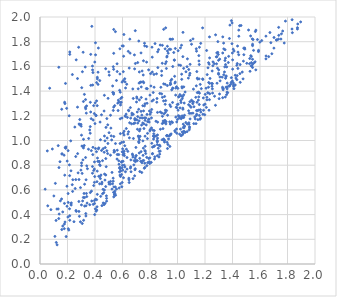
| Category | Series 0 |
|---|---|
| 1.2218439012456264 | 1.588 |
| 1.098014895399271 | 1.269 |
| 1.2983061203218698 | 1.649 |
| 0.3839702323072054 | 0.886 |
| 0.6031992104288864 | 0.884 |
| 0.9185398873408457 | 1.638 |
| 0.3338678232084469 | 0.389 |
| 0.30999605804753827 | 0.51 |
| 0.9876129833916178 | 1.19 |
| 0.44720470974408544 | 1.208 |
| 0.33435444458668484 | 0.471 |
| 0.5562552307957596 | 0.607 |
| 1.2936754097176255 | 1.801 |
| 1.0272133026357173 | 1.177 |
| 0.5844185690861705 | 0.649 |
| 1.3028751654369137 | 1.339 |
| 0.41093475952205183 | 0.909 |
| 1.5366162030314177 | 1.681 |
| 0.8508044712303935 | 1.34 |
| 0.5442990048847431 | 0.59 |
| 0.21380399254861637 | 0.803 |
| 0.41482181783545324 | 0.463 |
| 0.40775211635299624 | 1.204 |
| 1.776053556077506 | 1.789 |
| 1.11106400504377 | 1.298 |
| 0.28102032400536237 | 1.755 |
| 0.9775978779791148 | 1.65 |
| 0.21647126948937845 | 1.697 |
| 0.4116763271382473 | 1.469 |
| 1.3460215947219256 | 1.735 |
| 0.611390552367961 | 1.044 |
| 0.9020472815559084 | 1.216 |
| 1.1184892065275662 | 1.137 |
| 1.1417345326340806 | 1.309 |
| 1.0132638590411123 | 1.182 |
| 0.32403097244305856 | 0.538 |
| 1.0615949629122707 | 1.556 |
| 1.169915397426366 | 1.23 |
| 1.1385003844497923 | 1.723 |
| 1.0477382701204396 | 1.103 |
| 0.5762318395763861 | 0.616 |
| 0.8668297736381099 | 0.912 |
| 0.6125606962958849 | 0.8 |
| 1.5580042286616895 | 1.63 |
| 0.27282163506710044 | 1.27 |
| 1.2572452846246833 | 1.605 |
| 0.7579924179842967 | 1.183 |
| 1.4198943572264673 | 1.449 |
| 0.3696309892706051 | 1.447 |
| 1.4072451319230919 | 1.449 |
| 1.5496914641966506 | 1.817 |
| 0.9404242631431408 | 1.739 |
| 0.5926450566075927 | 0.824 |
| 0.8956817855322194 | 1.158 |
| 0.9831424720119029 | 1.071 |
| 1.0853105222925261 | 1.22 |
| 0.9158376140196698 | 1.134 |
| 0.5952484536624827 | 1.349 |
| 1.026166147746547 | 1.039 |
| 1.0836086596257017 | 1.131 |
| 0.9943617862884919 | 1.15 |
| 0.8089333514799006 | 0.823 |
| 0.9346957195443937 | 1.013 |
| 0.7426169409774064 | 1.563 |
| 1.045715516224044 | 1.434 |
| 1.041973174788376 | 1.105 |
| 0.29441975231596085 | 0.618 |
| 0.7978713951440373 | 0.814 |
| 0.830683358484164 | 1.08 |
| 0.9263345700008605 | 1.445 |
| 0.3852389580686846 | 0.945 |
| 0.5972157759141059 | 0.779 |
| 1.1020580253099674 | 1.779 |
| 0.2235709859438535 | 0.997 |
| 0.6263000988285177 | 1.214 |
| 1.032482929524119 | 1.435 |
| 0.9728016430047752 | 1.712 |
| 1.3099792966071393 | 1.483 |
| 0.8892706660572447 | 1.625 |
| 0.8175702196041836 | 0.892 |
| 1.3767637211063037 | 1.444 |
| 0.8845185093942953 | 1.527 |
| 0.7539577371047679 | 0.838 |
| 1.5459434971788726 | 1.591 |
| 1.0234213303663824 | 1.323 |
| 0.6277295385501236 | 1.097 |
| 0.7483840160849888 | 0.997 |
| 0.8603188429485731 | 0.937 |
| 1.4347417296441138 | 1.623 |
| 0.5835977730184894 | 1.391 |
| 0.57826173062942 | 0.746 |
| 0.25598270873921614 | 0.611 |
| 1.5645076297075593 | 1.637 |
| 0.43220225079006713 | 0.827 |
| 1.3452482734581228 | 1.648 |
| 0.7938848960934706 | 0.828 |
| 0.5393514409625824 | 0.92 |
| 0.8002662267528184 | 1.212 |
| 1.6720300216923099 | 1.874 |
| 1.1515663303154453 | 1.327 |
| 0.7713178461223904 | 1.335 |
| 1.431703862487234 | 1.493 |
| 0.7531014100896376 | 1.24 |
| 0.13690277748655744 | 1.593 |
| 0.7033460478603368 | 1.352 |
| 0.2147112240423552 | 0.447 |
| 0.5939200315358202 | 0.985 |
| 0.5330532696309866 | 1.597 |
| 1.1484378250664349 | 1.169 |
| 0.8741105018048414 | 1.773 |
| 0.31564634079833986 | 1.316 |
| 0.9808428145961892 | 1.08 |
| 0.6042654760241108 | 0.832 |
| 0.8327957148277367 | 0.956 |
| 1.0342683498548746 | 1.339 |
| 1.0877340532110122 | 1.529 |
| 0.6420604974288147 | 1.722 |
| 0.608230958419167 | 1.682 |
| 0.5933943836059778 | 0.725 |
| 0.6118853155468102 | 1.076 |
| 0.7236319418503554 | 1.006 |
| 1.2989352762787736 | 1.536 |
| 1.8335302098636443 | 1.978 |
| 0.3152180063910466 | 0.539 |
| 0.6120678479395079 | 0.914 |
| 0.5856144713421705 | 1.287 |
| 0.10082685639073419 | 0.551 |
| 0.6935753725881428 | 1.623 |
| 0.8714780343473179 | 1.381 |
| 1.3615931056602362 | 1.465 |
| 0.671887957357443 | 0.89 |
| 0.8121758794493519 | 1.251 |
| 0.9268505017884752 | 1.725 |
| 0.7784021240848733 | 1.211 |
| 1.5317370297482054 | 1.847 |
| 1.0829780837714365 | 1.143 |
| 1.233466786739652 | 1.669 |
| 0.708589514465525 | 1.091 |
| 0.2978116857149764 | 1.131 |
| 0.9633858408181453 | 1.145 |
| 0.6929328786871911 | 1.889 |
| 1.5459555457068062 | 1.768 |
| 0.9064107741863041 | 1.002 |
| 0.7828540420382242 | 1.153 |
| 0.9839532680753853 | 1.473 |
| 0.5730467726893789 | 0.886 |
| 1.598975551555259 | 1.796 |
| 0.316299216477099 | 1.01 |
| 0.1901160977747185 | 0.222 |
| 1.433943611413578 | 1.525 |
| 0.7368903179334834 | 1.348 |
| 0.7215544270673266 | 0.899 |
| 0.6682327233794096 | 1.221 |
| 0.10855839887400931 | 0.224 |
| 1.1893593227495252 | 1.245 |
| 0.8750971402947192 | 1.231 |
| 1.030131623295237 | 1.537 |
| 0.6792832802877506 | 1.016 |
| 0.5156293567053438 | 1.101 |
| 1.0099032024932786 | 1.611 |
| 0.5810954588714137 | 1.743 |
| 0.22485752225037592 | 0.486 |
| 0.7400489391606699 | 0.741 |
| 1.0418043898503475 | 1.133 |
| 1.2326456637022105 | 1.839 |
| 0.701913542903674 | 1.312 |
| 0.32894804692453183 | 1.595 |
| 1.2344538855298488 | 1.379 |
| 0.6487431745905416 | 1.587 |
| 1.0788973973462948 | 1.505 |
| 0.8182332834815869 | 0.946 |
| 1.359258664342939 | 1.431 |
| 0.1800401520075816 | 0.719 |
| 0.6974814407696226 | 0.944 |
| 0.5354839519745496 | 1.576 |
| 1.1732841332734962 | 1.42 |
| 0.8287468140334626 | 1.535 |
| 0.7515228227007948 | 0.938 |
| 0.5679885143467776 | 1.242 |
| 1.4769292375593372 | 1.499 |
| 0.4725618126500639 | 0.997 |
| 1.1572285149585693 | 1.499 |
| 0.705478199004139 | 1.167 |
| 0.9446103707527298 | 0.952 |
| 1.0054892699931313 | 1.201 |
| 0.15867802653583385 | 0.279 |
| 0.5619079732628445 | 0.886 |
| 1.5696539278500001 | 1.572 |
| 1.1094724922208865 | 1.314 |
| 0.9244494545173734 | 0.985 |
| 0.7195078870267326 | 0.983 |
| 1.4621160274763882 | 1.931 |
| 1.1583889036103905 | 1.615 |
| 0.3426089538836803 | 0.493 |
| 1.1587952828556718 | 1.203 |
| 0.9640875106986238 | 1.308 |
| 0.4170264989627428 | 1.512 |
| 0.7348562723620775 | 1.236 |
| 0.23554556971769225 | 1.534 |
| 1.4899104722100902 | 1.74 |
| 0.36177269522160405 | 0.48 |
| 1.8957463833883945 | 1.96 |
| 1.3272772158403192 | 1.431 |
| 0.8041658039727637 | 1.541 |
| 0.4393831482159234 | 0.692 |
| 0.40336457067451614 | 1.791 |
| 0.18133560581736718 | 1.299 |
| 0.7077701345903693 | 0.837 |
| 0.8531901976618477 | 0.877 |
| 0.5614235871138877 | 1.558 |
| 0.4860871238617075 | 1.177 |
| 0.4434238108316426 | 0.72 |
| 0.9062695790835005 | 1.356 |
| 0.736388670372232 | 1.434 |
| 0.4504680736435942 | 0.662 |
| 0.4918397272495463 | 0.894 |
| 0.6328616122141804 | 0.862 |
| 1.0399426568287011 | 1.876 |
| 1.0513311547775737 | 1.116 |
| 1.1386825178260347 | 1.242 |
| 1.1289466691160808 | 1.175 |
| 0.4222069447723713 | 1.454 |
| 0.6896781710652691 | 1.177 |
| 0.4656247719941722 | 0.48 |
| 1.0909398721811447 | 1.28 |
| 0.2598017860643078 | 0.87 |
| 0.7496070964246719 | 0.88 |
| 1.2118370887275098 | 1.729 |
| 0.1765838065834633 | 0.286 |
| 0.5176988614106606 | 1.038 |
| 0.5350907005591026 | 1.375 |
| 0.8199975516259286 | 1.084 |
| 1.147028287477013 | 1.498 |
| 1.4563860540414724 | 1.471 |
| 0.38305811722215255 | 1.449 |
| 1.1599083739094875 | 1.383 |
| 0.6572685529970399 | 1.266 |
| 1.3789534199669327 | 1.441 |
| 0.9647308391014944 | 1.821 |
| 0.8298556559602015 | 1.431 |
| 0.6924761866439733 | 0.771 |
| 1.0260493575688001 | 1.307 |
| 1.0154909617268193 | 1.051 |
| 0.5359083844310255 | 1.385 |
| 0.3524459421707431 | 0.93 |
| 1.1159388633155445 | 1.313 |
| 0.5421963695091325 | 0.562 |
| 0.4550096738464813 | 0.569 |
| 0.9119630500511589 | 1.622 |
| 0.5449536239142332 | 0.572 |
| 0.7753023612177816 | 1.635 |
| 0.45845547068731807 | 0.605 |
| 0.28322464153042604 | 0.426 |
| 1.0268078129248248 | 1.181 |
| 0.7141060475565466 | 1.419 |
| 1.0469616209504766 | 1.074 |
| 0.3662745925865627 | 1.309 |
| 0.42737248701645303 | 0.71 |
| 1.0388839749428 | 1.262 |
| 1.55297010371751 | 1.73 |
| 1.1664988419980773 | 1.249 |
| 0.5360246899322796 | 1.706 |
| 1.6431946055742126 | 1.661 |
| 0.9305455122461996 | 0.967 |
| 0.6061363205018213 | 1.765 |
| 0.8703965388262129 | 0.889 |
| 1.5360738263535543 | 1.603 |
| 0.5111682980276921 | 0.647 |
| 0.5984672556990174 | 0.909 |
| 0.3950396150239621 | 1.218 |
| 1.1559559180359398 | 1.644 |
| 1.0391443223941244 | 1.679 |
| 1.1829047715751349 | 1.499 |
| 0.7232654016447517 | 1.077 |
| 0.33082951495144663 | 1.27 |
| 0.2162897112247899 | 0.354 |
| 0.7280379294299506 | 1.034 |
| 1.2159471007621465 | 1.534 |
| 0.49276166752800776 | 1.127 |
| 1.3569303457659465 | 1.371 |
| 0.42917067157886213 | 0.832 |
| 1.400968999393942 | 1.578 |
| 0.28762122238618293 | 1.129 |
| 0.8944297144158875 | 1.096 |
| 1.3580967153816699 | 1.596 |
| 0.4686672674234116 | 1.036 |
| 1.1441023634939171 | 1.388 |
| 0.9264222117706054 | 1.763 |
| 0.6435020915970244 | 1.245 |
| 0.9508598157283614 | 1.456 |
| 0.7406128589610899 | 1.206 |
| 1.0184672564961297 | 1.264 |
| 0.7641196455293999 | 1.035 |
| 0.7563490404740141 | 1.134 |
| 0.9953606778991717 | 1.058 |
| 0.481411744306921 | 0.788 |
| 1.2323867523000713 | 1.331 |
| 1.0919162704512912 | 1.617 |
| 1.221625907459518 | 1.386 |
| 1.3612037412775655 | 1.418 |
| 0.5812936299337086 | 1.538 |
| 1.1844071880578293 | 1.494 |
| 1.2859736452021324 | 1.71 |
| 1.4542233441455035 | 1.541 |
| 0.4245695057152208 | 1.749 |
| 1.3320489006404805 | 1.421 |
| 0.717708837889123 | 1.253 |
| 0.30363263930241247 | 1.428 |
| 0.7997465710151417 | 1.367 |
| 0.9485721478350315 | 1.465 |
| 0.3171425597457733 | 0.354 |
| 0.8143590010212451 | 1.319 |
| 0.344908593684101 | 0.772 |
| 1.3251021634850468 | 1.513 |
| 0.35388479573483655 | 1.016 |
| 0.5485294435691475 | 1.881 |
| 0.9473765629220257 | 1.133 |
| 1.1538265783660666 | 1.391 |
| 1.1592704566812244 | 1.755 |
| 0.7175130114111308 | 0.991 |
| 0.4132548873710453 | 0.437 |
| 0.29955293029459984 | 1.116 |
| 0.42013752800392457 | 0.831 |
| 0.381556075953962 | 0.789 |
| 0.7731310248896628 | 1.421 |
| 0.9063116127575035 | 1.148 |
| 0.8233687381296269 | 1.388 |
| 1.4083705981495895 | 1.438 |
| 0.205597692026118 | 0.285 |
| 1.2365287311468578 | 1.503 |
| 0.9521422946384925 | 1.819 |
| 1.2204996942721946 | 1.386 |
| 1.3070983194879373 | 1.659 |
| 0.7207651381117288 | 1.159 |
| 0.26427039403099384 | 0.426 |
| 0.9269919106679096 | 0.935 |
| 0.8556763439240755 | 1.718 |
| 1.3530156055650011 | 1.432 |
| 0.923223237327792 | 1.041 |
| 0.6223018093836972 | 1.425 |
| 0.47241129021205697 | 0.68 |
| 0.9322082297919252 | 1.707 |
| 1.445744699134523 | 1.894 |
| 1.1557171219072664 | 1.247 |
| 0.5212716756061033 | 1.004 |
| 0.542178217545155 | 0.56 |
| 1.734104984620247 | 1.821 |
| 0.5702813843730699 | 1.327 |
| 0.5326325532829821 | 0.671 |
| 0.8571218427572314 | 1.59 |
| 0.5037031525339817 | 1.529 |
| 0.998064276338394 | 1.291 |
| 0.7595942467378398 | 1.28 |
| 1.28679077238717 | 1.678 |
| 1.2537670759262167 | 1.46 |
| 0.617503284737086 | 0.786 |
| 0.5966541451238987 | 1.182 |
| 0.7640198577513377 | 1.298 |
| 1.4107228453776022 | 1.42 |
| 0.37321778727640065 | 0.918 |
| 0.11675335911017837 | 0.353 |
| 1.527677843087685 | 1.56 |
| 1.3697469417442047 | 1.631 |
| 0.17756114699735037 | 0.324 |
| 0.9809168632436327 | 1.465 |
| 0.44128101023469113 | 0.548 |
| 0.7478004787939521 | 1.281 |
| 1.0488338151182124 | 1.303 |
| 0.36128792094212514 | 1.085 |
| 0.3247864497795405 | 0.469 |
| 1.1438786335205504 | 1.505 |
| 0.3954128463098152 | 0.513 |
| 0.5655496817371384 | 1.303 |
| 1.3720780643709671 | 1.682 |
| 1.6632634554533845 | 1.679 |
| 0.2534635448320801 | 1.109 |
| 0.4339252262408604 | 0.649 |
| 0.9791003177777642 | 1.52 |
| 0.9951944464993214 | 1.266 |
| 0.9657395266796094 | 1.422 |
| 0.12307852951711218 | 0.445 |
| 0.4361264053144842 | 0.709 |
| 0.8757122243338036 | 1.091 |
| 0.5991230476101763 | 0.798 |
| 0.7686844769785539 | 0.895 |
| 0.5807324583340321 | 0.783 |
| 0.9100417820147795 | 1.742 |
| 0.6925028335281178 | 0.859 |
| 0.6609248646386956 | 0.843 |
| 0.8547406535673125 | 1.045 |
| 0.2121797114022257 | 1.2 |
| 1.2932527981877473 | 1.714 |
| 0.45466020013040986 | 0.837 |
| 0.7499515859753592 | 1.476 |
| 1.2909388448611196 | 1.585 |
| 1.7850536887579198 | 1.967 |
| 1.136529911691882 | 1.743 |
| 1.589446461442532 | 1.73 |
| 0.8554631574639058 | 1.148 |
| 0.8736747311993678 | 0.954 |
| 0.23707538896356262 | 0.588 |
| 1.0699492138184499 | 1.072 |
| 1.7650539367011653 | 1.886 |
| 1.5332451715376307 | 1.687 |
| 0.31266939673935634 | 0.952 |
| 0.9505943864150721 | 1.275 |
| 0.6850128043933019 | 0.837 |
| 0.5847583993227867 | 1.056 |
| 0.7819604637828463 | 1.058 |
| 0.8903845899614979 | 1.196 |
| 1.035996640441257 | 1.046 |
| 0.8847263275344706 | 1.563 |
| 0.31375465829314786 | 1.715 |
| 0.43966352800713704 | 1.006 |
| 0.38224838450005727 | 1.572 |
| 1.133010235328639 | 1.349 |
| 1.4314419432200818 | 1.609 |
| 1.5702102339087451 | 1.894 |
| 1.1128404948477884 | 1.823 |
| 1.0176847203249602 | 1.372 |
| 0.13637475051319625 | 0.368 |
| 0.11860145658523624 | 0.174 |
| 1.0983253627654617 | 1.22 |
| 1.5371915150530182 | 1.631 |
| 1.4008997641598142 | 1.653 |
| 0.5909593019766808 | 1.31 |
| 0.8432239569175235 | 1.156 |
| 0.5620123470379008 | 0.921 |
| 1.0872630942910402 | 1.111 |
| 0.7989648197917767 | 1.078 |
| 0.8328720035522088 | 0.85 |
| 0.537410289808123 | 0.624 |
| 0.7417678081173402 | 0.819 |
| 0.4220529976101226 | 1.553 |
| 0.8349218740116411 | 0.868 |
| 0.26157937648799634 | 0.433 |
| 0.754121194823429 | 1.468 |
| 1.1824645599855965 | 1.912 |
| 0.45052250998550614 | 0.473 |
| 1.3414729428956589 | 1.555 |
| 0.3014385236513766 | 0.478 |
| 0.7055624871076516 | 1.342 |
| 0.6782839035664838 | 1.341 |
| 0.5124827171537243 | 0.881 |
| 1.2266910104228403 | 1.469 |
| 0.1778261719614096 | 0.491 |
| 1.1553596371227508 | 1.687 |
| 1.4247561332160223 | 1.506 |
| 0.7186078930940021 | 1.805 |
| 0.8884234479663979 | 1.006 |
| 0.6682205372946877 | 1.206 |
| 1.8329128028686068 | 1.903 |
| 1.1255670874791817 | 1.191 |
| 1.201508176478414 | 1.373 |
| 1.2012478142240797 | 1.295 |
| 0.30502637512801245 | 0.955 |
| 0.9280393211444653 | 1.205 |
| 0.8789820020601276 | 1.431 |
| 0.9056015928582195 | 0.987 |
| 0.6010289352483627 | 0.932 |
| 0.5320547157662705 | 0.695 |
| 0.5328939965551052 | 1.244 |
| 0.874300640303646 | 0.914 |
| 0.14527537815524827 | 0.828 |
| 0.7584348199973876 | 0.776 |
| 0.6102301977583884 | 1.858 |
| 0.21658665157826062 | 1.717 |
| 1.0447961119007918 | 1.186 |
| 1.3319295254940213 | 1.411 |
| 0.39547040717190485 | 0.769 |
| 1.1121984649698275 | 1.221 |
| 0.854639704787967 | 1.019 |
| 0.8071991298504182 | 1.228 |
| 0.675049184525397 | 1.417 |
| 0.13248392315997415 | 0.958 |
| 0.1393786875026406 | 0.404 |
| 0.7691860078938237 | 1.183 |
| 0.957758863112484 | 1.496 |
| 0.6961327642528732 | 0.84 |
| 1.3973275129982476 | 1.952 |
| 0.6029827377339434 | 0.905 |
| 1.4199581060074264 | 1.528 |
| 0.8162904666906139 | 1.675 |
| 1.3650317101893525 | 1.387 |
| 0.2827360408477746 | 0.506 |
| 1.29820962867925 | 1.544 |
| 0.7230329217058284 | 1.329 |
| 1.0338983131907677 | 1.07 |
| 1.755881361744406 | 1.864 |
| 0.5367131943552692 | 1.033 |
| 0.9929387803097551 | 1.093 |
| 0.5274414040695239 | 0.65 |
| 0.6899498170408143 | 1.141 |
| 0.3986019865809689 | 1.635 |
| 0.2252115326944113 | 0.755 |
| 0.6517753845424585 | 1.143 |
| 0.17525616024358426 | 0.881 |
| 0.9225669276549431 | 1.676 |
| 1.5439083050429405 | 1.823 |
| 0.5853966526480276 | 1.307 |
| 0.376222318005206 | 0.51 |
| 1.5664042497073651 | 1.883 |
| 1.5239764910208253 | 1.622 |
| 0.8688944080991061 | 0.961 |
| 0.5869617274327297 | 1.34 |
| 0.9207018289636886 | 1.242 |
| 1.7365821136627224 | 1.852 |
| 1.1393855841057008 | 1.212 |
| 0.6533232916265657 | 1.821 |
| 0.536073825313123 | 1.899 |
| 1.0854799276605314 | 1.087 |
| 1.2967976635802982 | 1.697 |
| 0.4346800134719675 | 1.485 |
| 0.9208053513602332 | 1.038 |
| 1.1584310402681406 | 1.291 |
| 0.1381102681569324 | 0.781 |
| 1.033225310942381 | 1.426 |
| 0.39014590893727297 | 1.282 |
| 1.042753115419136 | 1.19 |
| 0.3022081630846103 | 0.818 |
| 0.7346688796082557 | 1.473 |
| 0.33121554497143646 | 1.331 |
| 0.8131659744024073 | 0.977 |
| 0.9457544402825058 | 1.821 |
| 0.8275784549059821 | 0.951 |
| 0.17916285965748657 | 1.31 |
| 1.5457992879483937 | 1.657 |
| 0.5479734842693906 | 0.624 |
| 0.320276159070209 | 0.571 |
| 1.5409608141215818 | 1.605 |
| 0.22679497783314972 | 0.477 |
| 1.1194372940982955 | 1.273 |
| 0.3978734296452826 | 0.708 |
| 0.4159970453215114 | 1.282 |
| 0.056481289587323014 | 0.471 |
| 1.0142927673491597 | 1.196 |
| 0.36860238040454263 | 1.231 |
| 0.9762155721551531 | 1.652 |
| 0.7643516404876305 | 1.163 |
| 0.8339196326369882 | 1.033 |
| 0.5779797451717619 | 0.777 |
| 0.8065085716842288 | 1.441 |
| 0.48309221959683124 | 0.552 |
| 0.6659531557879299 | 1.135 |
| 0.8545754650711865 | 1.228 |
| 1.0903435485854784 | 1.544 |
| 0.7960486961205553 | 1.239 |
| 1.1548465827812366 | 1.353 |
| 0.16562339845436913 | 0.307 |
| 1.2696325556595187 | 1.359 |
| 1.2253726703384977 | 1.431 |
| 0.541621698474823 | 0.911 |
| 0.372323834918576 | 1.177 |
| 1.3307752371038315 | 1.419 |
| 0.7206972437259656 | 1.465 |
| 0.053173935926630556 | 0.916 |
| 0.3957381378528788 | 0.661 |
| 1.39931397426615 | 1.482 |
| 0.824764788013727 | 1.329 |
| 0.6906069202391609 | 0.763 |
| 0.5746826932777906 | 0.808 |
| 1.2823203111859487 | 1.677 |
| 0.6964907083167196 | 0.874 |
| 1.8353693358574215 | 1.873 |
| 0.3815791110127318 | 1.603 |
| 1.391851743350455 | 1.97 |
| 0.2893210066241658 | 1.17 |
| 0.587659838568509 | 0.753 |
| 0.2976655751656483 | 0.76 |
| 0.7108830863931952 | 1.141 |
| 1.451675098302165 | 1.929 |
| 0.4039580089338073 | 1.694 |
| 0.7991372915705266 | 0.86 |
| 0.07936720064783098 | 0.44 |
| 1.0377204504651694 | 1.356 |
| 0.8895241238932405 | 1.137 |
| 0.7771492158405933 | 0.796 |
| 0.38506008202053255 | 1.55 |
| 0.5357150241595625 | 1.271 |
| 1.25110105329228 | 1.439 |
| 0.18203794475266522 | 0.34 |
| 1.1980838917793866 | 1.209 |
| 0.6746249856347515 | 0.882 |
| 0.6827191007027811 | 0.802 |
| 1.3621410020239972 | 1.434 |
| 0.46836698784415143 | 0.599 |
| 1.7186831075255655 | 1.814 |
| 0.12444407426209314 | 0.155 |
| 0.6928078270960718 | 1.167 |
| 0.23890620906110804 | 0.682 |
| 0.5602002281514593 | 0.85 |
| 0.6593138274706682 | 1.181 |
| 0.3655838368505475 | 1.112 |
| 1.4793738098811235 | 1.643 |
| 0.18906854177490673 | 0.948 |
| 0.6621658954199372 | 0.747 |
| 1.440096452619907 | 1.716 |
| 0.7831307060043711 | 0.82 |
| 1.643263533747122 | 1.845 |
| 0.4728219573465917 | 0.491 |
| 1.165507744481734 | 1.454 |
| 0.4594208664188393 | 0.934 |
| 0.6027843466110596 | 0.759 |
| 1.2551506114462314 | 1.384 |
| 0.41729130916232116 | 1.499 |
| 0.8532229879989319 | 0.992 |
| 0.34010414288522806 | 0.546 |
| 0.9191395750102354 | 1.583 |
| 0.46830746175631566 | 1.366 |
| 0.3652174988159669 | 1.059 |
| 0.8991345910963813 | 1.012 |
| 0.957877649496903 | 1.41 |
| 0.923938530386861 | 1.683 |
| 0.3998883995160103 | 1.137 |
| 0.6470055366185241 | 0.682 |
| 1.2581834144276762 | 1.637 |
| 0.6133286844766395 | 0.877 |
| 0.20456690083768114 | 0.571 |
| 0.3228418139546172 | 1.373 |
| 1.3990696982524649 | 1.708 |
| 0.33304574570638534 | 0.408 |
| 1.5812887038956354 | 1.817 |
| 0.8530014844345697 | 0.989 |
| 1.3287311500415795 | 1.346 |
| 0.1853428222272775 | 1.462 |
| 0.5236388679428197 | 0.606 |
| 1.0332811433241227 | 1.2 |
| 0.6285338119995441 | 0.93 |
| 0.9486222174888737 | 1.046 |
| 0.7909716616965989 | 0.855 |
| 0.7105180280131151 | 1.631 |
| 0.5734290575812788 | 1.311 |
| 1.2305335833000381 | 1.618 |
| 0.20966078938539834 | 0.275 |
| 1.3489871293865108 | 1.667 |
| 0.5237449891582446 | 0.742 |
| 0.44971928865159394 | 0.648 |
| 1.349645269900196 | 1.615 |
| 0.7657419978895956 | 0.914 |
| 0.6327292977412393 | 0.768 |
| 0.5498683516953802 | 0.556 |
| 1.588810061696633 | 1.72 |
| 0.6900214997183225 | 1.167 |
| 1.8747165961063872 | 1.943 |
| 1.1878647737060064 | 1.345 |
| 0.6195578261030366 | 1.199 |
| 0.5386043066569881 | 0.905 |
| 1.4888539725812695 | 1.749 |
| 0.5950249167650288 | 0.626 |
| 0.15902665948236905 | 0.89 |
| 1.3601913251407818 | 1.391 |
| 0.4842836220041018 | 0.531 |
| 1.6442579458289395 | 1.684 |
| 0.6456457233293187 | 1.241 |
| 0.7560988289430646 | 1.097 |
| 1.1848877336779426 | 1.212 |
| 0.635628597714383 | 1.187 |
| 0.8365972773772539 | 1.785 |
| 0.39668816209832825 | 0.49 |
| 0.3122430290936906 | 0.843 |
| 1.3495205139673525 | 1.504 |
| 1.0265050785682261 | 1.36 |
| 0.8276452339323106 | 1.054 |
| 1.0815663796387023 | 1.575 |
| 1.0029892142421952 | 1.422 |
| 0.3688441956153323 | 1.697 |
| 1.0709757550634602 | 1.133 |
| 1.2078323887897968 | 1.423 |
| 0.08990121697938247 | 0.931 |
| 1.072221956996583 | 1.661 |
| 1.406634097928618 | 1.465 |
| 0.5941545507519306 | 0.828 |
| 0.20512698718729405 | 0.499 |
| 1.0084362080964369 | 1.353 |
| 0.1606017941721276 | 0.893 |
| 0.7002381282331902 | 0.878 |
| 0.8653284232875944 | 0.867 |
| 1.5471112018616633 | 1.619 |
| 1.137333899728552 | 1.202 |
| 1.8723244401686312 | 1.914 |
| 0.19378658688458472 | 1.26 |
| 1.3479077867649762 | 1.353 |
| 0.8258879844045699 | 1.012 |
| 0.28663175445129996 | 0.386 |
| 1.3872433062174059 | 1.455 |
| 0.9117984911965056 | 1.245 |
| 0.40121070984781015 | 1.304 |
| 0.6214157068838857 | 0.747 |
| 0.7899549445286864 | 1.572 |
| 0.8186780489661851 | 0.894 |
| 1.0810457639989157 | 1.241 |
| 0.8169074133899377 | 1.554 |
| 0.4073282116505321 | 1.201 |
| 0.7648899863318506 | 0.953 |
| 0.6867863691771341 | 1.693 |
| 1.0420641331447165 | 1.057 |
| 0.27281944910637 | 1.502 |
| 0.6577045206734595 | 0.777 |
| 0.6596726884412849 | 0.787 |
| 1.0383006091970515 | 1.189 |
| 0.20453757630681935 | 0.918 |
| 0.40793828118451336 | 0.427 |
| 1.0215125105720528 | 1.092 |
| 0.9090110606704127 | 1.163 |
| 0.6766924688241087 | 0.691 |
| 1.4115861705183133 | 1.725 |
| 1.3916096307249886 | 1.509 |
| 0.2160951462998686 | 0.391 |
| 0.19604897710777047 | 0.63 |
| 0.4797839533143746 | 1.106 |
| 1.0508401569817238 | 1.204 |
| 1.0915766942353873 | 1.175 |
| 1.0874578080972428 | 1.102 |
| 1.525413148556475 | 1.664 |
| 0.5823307734259402 | 0.976 |
| 0.512984179948097 | 0.669 |
| 0.5976268059274175 | 1.766 |
| 1.1639620157664847 | 1.172 |
| 0.7627385798522024 | 0.918 |
| 1.3813308108853648 | 1.934 |
| 0.7761897310600143 | 1.761 |
| 1.0565633820607068 | 1.066 |
| 0.4743823444106585 | 0.943 |
| 0.6462227953202524 | 0.695 |
| 0.6394372265699149 | 1.052 |
| 1.2838870363070831 | 1.621 |
| 0.7351316091752134 | 0.91 |
| 1.0046377906656658 | 1.727 |
| 0.37695334448132134 | 1.924 |
| 0.7276262761149068 | 1.183 |
| 0.365822097356993 | 0.579 |
| 0.9173008748066152 | 1.152 |
| 1.6789645913328437 | 1.792 |
| 0.648504606007789 | 0.66 |
| 1.0307856512677012 | 1.495 |
| 0.7614253878151638 | 1.766 |
| 1.080923732581063 | 1.29 |
| 1.2138594779553633 | 1.35 |
| 1.3438370158501844 | 1.596 |
| 0.4040739169579788 | 0.935 |
| 1.3902650318226002 | 1.47 |
| 0.6166418834577738 | 0.958 |
| 0.26322020330799734 | 1.653 |
| 1.5460370207197083 | 1.78 |
| 0.33510117691076835 | 0.682 |
| 0.7924402641247212 | 1.172 |
| 0.734664247903466 | 1.709 |
| 0.30726998254732507 | 0.328 |
| 0.2842899276165394 | 1.134 |
| 0.7289935583150284 | 1.472 |
| 0.6941083995668005 | 0.829 |
| 0.643933827047265 | 1.071 |
| 0.5010189124502233 | 1.555 |
| 1.3543746248822308 | 1.522 |
| 0.1578656519334285 | 1.253 |
| 0.8679720999996474 | 0.96 |
| 0.7432272092057934 | 1.182 |
| 0.03744860909753056 | 0.606 |
| 0.5350953189677432 | 0.58 |
| 0.500733191686483 | 0.662 |
| 0.6880958930852987 | 1.58 |
| 0.5969344198565294 | 1.473 |
| 0.9119015436860611 | 1.227 |
| 0.9105656663414001 | 1.293 |
| 1.4554971012137712 | 1.615 |
| 1.5040544604800024 | 1.625 |
| 0.14822169095322235 | 0.511 |
| 0.9291734297530441 | 1.038 |
| 0.30232675209570514 | 0.796 |
| 0.6756456752131257 | 0.866 |
| 0.8993538760406881 | 1.9 |
| 0.7072160831258432 | 1.231 |
| 0.5606058445039628 | 1.621 |
| 1.233506336094475 | 1.463 |
| 0.18371606827005804 | 0.943 |
| 0.22773425766580813 | 0.495 |
| 0.8107526001325176 | 1.183 |
| 0.5024069175158457 | 1.063 |
| 1.686253069539074 | 1.702 |
| 1.214252317240446 | 1.329 |
| 0.6072522156435112 | 0.698 |
| 0.4121410918294681 | 0.521 |
| 0.789803799779548 | 1.172 |
| 1.3288444031604592 | 1.709 |
| 1.2258946845365442 | 1.63 |
| 0.337464053613892 | 0.571 |
| 0.9580251638090855 | 1.152 |
| 0.6307244624282298 | 1.456 |
| 0.638768268133219 | 0.912 |
| 1.4393238945075126 | 1.583 |
| 1.2670750149033703 | 1.622 |
| 1.4825710177944442 | 1.695 |
| 1.2292521852548361 | 1.245 |
| 0.33214529591882114 | 1.257 |
| 0.8470685445850221 | 1.54 |
| 0.543357071521485 | 1.282 |
| 0.7259437755386631 | 0.749 |
| 0.1117748117642623 | 0.653 |
| 0.8496330846790769 | 1.31 |
| 0.9514694040117102 | 1.486 |
| 1.5168211198539268 | 1.894 |
| 0.47855633006752396 | 0.721 |
| 1.0945297083018592 | 1.81 |
| 1.0447656227365438 | 1.584 |
| 1.8720462269837792 | 1.902 |
| 1.0095731392242402 | 1.355 |
| 0.8280113869169929 | 1.032 |
| 0.3159959213923291 | 0.94 |
| 0.8438756682785846 | 1.038 |
| 0.9003411125692606 | 1.003 |
| 0.26034940284638375 | 0.683 |
| 1.2769151211437373 | 1.856 |
| 1.0694347284760717 | 1.597 |
| 0.9535125929016408 | 1.053 |
| 1.0395128814642771 | 1.253 |
| 1.101863697136538 | 1.326 |
| 0.7507251334245837 | 1.53 |
| 0.5839863662556237 | 0.771 |
| 0.2029632316930936 | 0.38 |
| 0.6116561284161661 | 0.892 |
| 1.2760359264301064 | 1.285 |
| 0.15709496642902088 | 0.527 |
| 0.9433139459347544 | 1.151 |
| 0.7524614943092056 | 1.645 |
| 0.7600362429791658 | 1.788 |
| 0.5364794888038675 | 0.543 |
| 0.3868903992566004 | 1.166 |
| 0.725376769943016 | 0.855 |
| 1.1345975536074926 | 1.136 |
| 0.5024970806581117 | 0.647 |
| 0.13241838522067173 | 0.446 |
| 1.1406039019249892 | 1.558 |
| 0.74746127119194 | 1.142 |
| 0.7388742449504888 | 1.125 |
| 0.7621126049474722 | 0.816 |
| 0.7812247664650918 | 1.015 |
| 1.021459963151527 | 1.75 |
| 1.0608489005013995 | 1.145 |
| 1.2999735205372518 | 1.572 |
| 0.6783537618163389 | 1.213 |
| 0.3367128617519679 | 1.222 |
| 0.990713308080005 | 1.269 |
| 1.3367879161989302 | 1.742 |
| 1.0043662896793044 | 1.245 |
| 1.7219745868803888 | 1.813 |
| 0.40218719798667757 | 0.447 |
| 0.9842010510337942 | 1.745 |
| 0.18700050297015625 | 0.937 |
| 0.7628594088131011 | 0.781 |
| 0.8848265306850744 | 1.378 |
| 0.852934293708312 | 1.001 |
| 0.39631672914119465 | 0.827 |
| 0.9651457792375675 | 1.425 |
| 0.5835121065291027 | 1.176 |
| 0.7452332614752455 | 0.835 |
| 0.33154947016772973 | 0.862 |
| 0.4668007950220108 | 0.905 |
| 0.5853186443727396 | 0.709 |
| 1.3086452971655262 | 1.514 |
| 0.7279539479625741 | 1.092 |
| 0.4475516009985703 | 0.919 |
| 0.4636685850113813 | 0.577 |
| 0.7727863086885853 | 1.126 |
| 0.6499806257896967 | 1.022 |
| 0.8145085316355518 | 1.756 |
| 0.28370980872342444 | 0.684 |
| 0.5128496637420699 | 1.204 |
| 0.32168805025074176 | 0.96 |
| 1.4052596509091808 | 1.739 |
| 0.21536106777998043 | 0.716 |
| 0.6165781720914085 | 1.5 |
| 0.6082556536155943 | 0.988 |
| 0.6055025165064274 | 1.485 |
| 0.9483176672960787 | 1.048 |
| 1.2520891252433877 | 1.563 |
| 0.5282667630231024 | 1.441 |
| 1.2493276286494546 | 1.462 |
| 0.7788604081977151 | 1.301 |
| 1.0291518004673936 | 1.771 |
| 0.9875201479263329 | 1.424 |
| 1.4711630921309446 | 1.554 |
| 0.8899389618878697 | 1.771 |
| 0.5292520801874485 | 1.389 |
| 1.0485993473222892 | 1.114 |
| 0.6062001887374762 | 1.061 |
| 1.7523153633618922 | 1.821 |
| 1.2099315785794875 | 1.268 |
| 0.5561177411217377 | 1.486 |
| 0.4696212297366875 | 0.728 |
| 0.49375809565729845 | 0.976 |
| 0.39051027331913657 | 0.635 |
| 0.2736952488440392 | 0.894 |
| 0.8903084157780301 | 1.349 |
| 0.9997178789809993 | 1.171 |
| 0.46611763854928445 | 1.239 |
| 0.6059331559235963 | 1.557 |
| 0.8622569043067532 | 1.736 |
| 0.3064509333064922 | 0.734 |
| 0.3083220217582805 | 1.557 |
| 0.6185866460820362 | 1.475 |
| 0.47769530500980095 | 1.581 |
| 0.8020522152776111 | 1.089 |
| 0.9140409448558424 | 1.912 |
| 0.1966682179011845 | 0.468 |
| 1.3058917353704005 | 1.376 |
| 0.9503751665554911 | 1.738 |
| 0.47854938398171876 | 0.854 |
| 0.7325997533014044 | 0.831 |
| 0.8240086820523389 | 1.036 |
| 1.0899271929457996 | 1.314 |
| 0.7106693570532812 | 1.193 |
| 0.4033222835547299 | 0.524 |
| 1.0224187367019186 | 1.608 |
| 0.7804657493667366 | 1.42 |
| 0.7761068502081336 | 0.863 |
| 0.9865879048241968 | 1.368 |
| 0.810973442218875 | 1.102 |
| 0.5728486798841463 | 0.836 |
| 1.3962299798514164 | 1.784 |
| 0.8995183101365831 | 1.459 |
| 0.9404821019177199 | 1.036 |
| 0.41814214567259467 | 0.858 |
| 0.5489409161986025 | 0.975 |
| 1.6126627664869646 | 1.809 |
| 0.6942287805099805 | 1.172 |
| 1.1908815823914058 | 1.288 |
| 0.9443138498262973 | 1.289 |
| 1.16735090036106 | 1.179 |
| 1.116035024442993 | 1.416 |
| 1.3519668164269152 | 1.516 |
| 0.8525878661971262 | 0.967 |
| 0.6554321245735351 | 1.707 |
| 0.48637901001346573 | 0.917 |
| 1.7356657186510362 | 1.916 |
| 0.3398965903586362 | 0.795 |
| 0.07032781662620513 | 1.424 |
| 0.5790105220419883 | 1.406 |
| 0.8987867806080119 | 1.321 |
| 1.0048786319381104 | 1.294 |
| 0.9931176404003037 | 1.435 |
| 0.41163447054492064 | 1.321 |
| 1.136870426305829 | 1.443 |
| 0.45956176357223755 | 0.494 |
| 1.168879179289572 | 1.787 |
| 0.32434853308951017 | 0.646 |
| 0.1976634213239743 | 0.833 |
| 0.3869849587224077 | 0.483 |
| 0.477760966295117 | 0.627 |
| 0.9471858885910207 | 1.452 |
| 0.3390283505014109 | 1.28 |
| 0.4144057340758416 | 0.666 |
| 1.4459464436009544 | 1.844 |
| 0.48435905337861707 | 0.509 |
| 0.5815539305520498 | 0.72 |
| 0.293810677633344 | 0.342 |
| 0.4951180759312306 | 1.341 |
| 0.4886318287777591 | 1.02 |
| 0.4333296128068682 | 0.805 |
| 1.0553599650406098 | 1.393 |
| 0.7224150627866732 | 1.555 |
| 0.38157220826068805 | 0.735 |
| 0.9138248233875603 | 1.323 |
| 0.43702014669442213 | 1.149 |
| 0.2771719203912273 | 0.738 |
| 0.3743548216120829 | 0.59 |
| 0.4245432014842869 | 0.932 |
| 0.43770845712937767 | 0.797 |
| 0.8856690534692511 | 1.223 |
| 1.3354477391842081 | 1.789 |
| 1.3369276679083955 | 1.533 |
| 0.2470682463791345 | 0.343 |
| 1.2876421192823981 | 1.464 |
| 0.397741960590557 | 0.4 |
| 0.39070680909148314 | 0.758 |
| 1.7013210930044294 | 1.748 |
| 1.2536422458203955 | 1.419 |
| 0.4275307081977595 | 0.94 |
| 0.30179412605320755 | 1.043 |
| 0.16548850618604138 | 0.422 |
| 0.9656308667842353 | 1.599 |
| 0.681956173049499 | 1.138 |
| 0.6203763607915207 | 1.195 |
| 0.8986198010655977 | 1.144 |
| 1.3293990974706986 | 1.839 |
| 1.4817797114702043 | 1.748 |
| 0.688407813376249 | 0.714 |
| 0.7146356031378476 | 1.036 |
| 1.4367338125904916 | 1.765 |
| 0.9105118701757138 | 1.455 |
| 1.0451331741827643 | 1.37 |
| 0.7940315745164921 | 1.149 |
| 1.445248427244915 | 1.695 |
| 1.701894010773595 | 1.834 |
| 0.5977705384821446 | 0.66 |
| 0.4168531700679883 | 0.564 |
| 1.1467416112290536 | 1.242 |
| 1.3775620644253337 | 1.826 |
| 0.7196678416286093 | 1.022 |
| 0.41638751817054676 | 0.752 |
| 0.23455905976548252 | 0.642 |